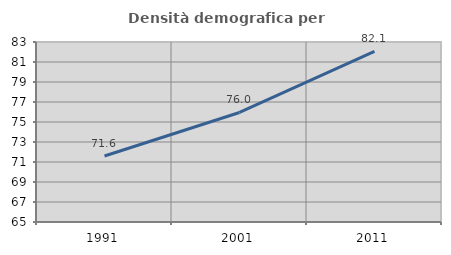
| Category | Densità demografica |
|---|---|
| 1991.0 | 71.597 |
| 2001.0 | 75.954 |
| 2011.0 | 82.063 |